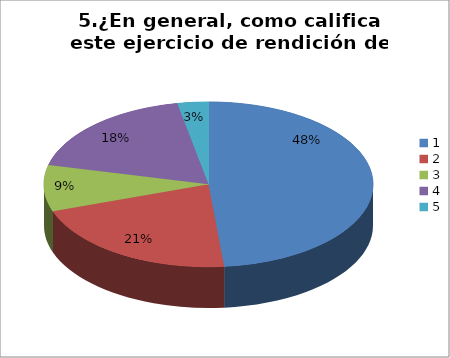
| Category | Series 0 |
|---|---|
| 0 | 16 |
| 1 | 7 |
| 2 | 3 |
| 3 | 6 |
| 4 | 1 |